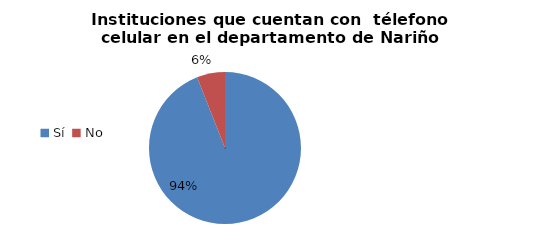
| Category | Series 0 |
|---|---|
| Sí | 0.94 |
| No | 0.06 |